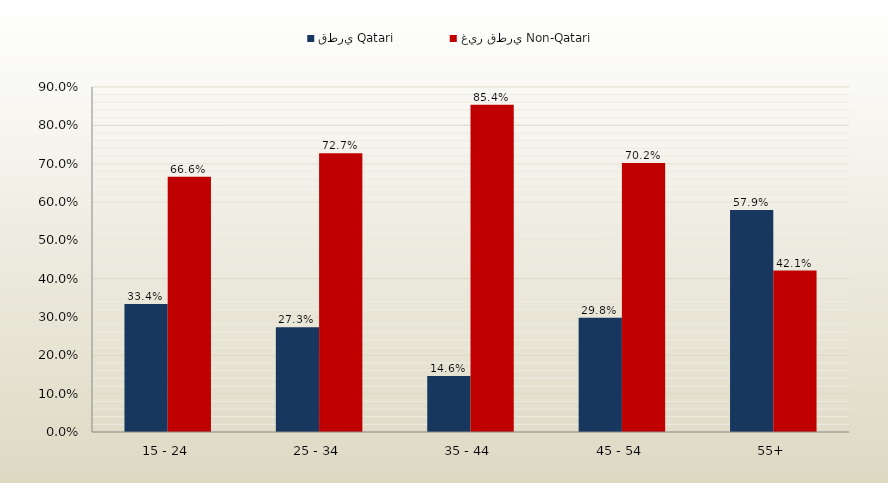
| Category | قطري Qatari | غير قطري Non-Qatari |
|---|---|---|
| 15 - 24 | 0.334 | 0.666 |
| 25 - 34 | 0.273 | 0.727 |
| 35 - 44 | 0.146 | 0.854 |
| 45 - 54 | 0.298 | 0.702 |
| 55+ | 0.579 | 0.421 |